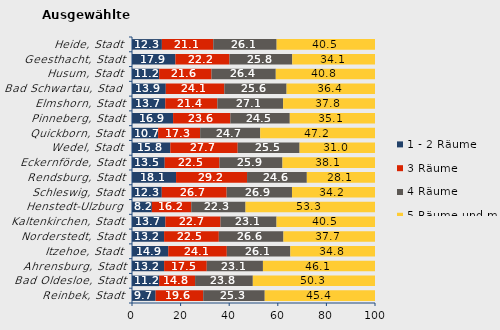
| Category | 1 - 2 Räume | 3 Räume | 4 Räume | 5 Räume und mehr |
|---|---|---|---|---|
| Reinbek, Stadt | 9.713 | 19.592 | 25.317 | 45.378 |
| Bad Oldesloe, Stadt | 11.156 | 14.805 | 23.761 | 50.279 |
| Ahrensburg, Stadt | 13.22 | 17.549 | 23.117 | 46.114 |
| Itzehoe, Stadt | 14.922 | 24.098 | 26.146 | 34.834 |
| Norderstedt, Stadt | 13.206 | 22.527 | 26.587 | 37.679 |
| Kaltenkirchen, Stadt | 13.749 | 22.67 | 23.06 | 40.521 |
| Henstedt-Ulzburg | 8.175 | 16.219 | 22.321 | 53.286 |
| Schleswig, Stadt | 12.256 | 26.692 | 26.889 | 34.163 |
| Rendsburg, Stadt | 18.13 | 29.217 | 24.602 | 28.051 |
| Eckernförde, Stadt | 13.463 | 22.53 | 25.924 | 38.083 |
| Wedel, Stadt | 15.779 | 27.725 | 25.463 | 31.033 |
| Quickborn, Stadt | 10.742 | 17.303 | 24.727 | 47.227 |
| Pinneberg, Stadt | 16.904 | 23.576 | 24.454 | 35.066 |
| Elmshorn, Stadt | 13.7 | 21.434 | 27.058 | 37.808 |
| Bad Schwartau, Stadt | 13.903 | 24.099 | 25.61 | 36.388 |
| Husum, Stadt | 11.162 | 21.558 | 26.449 | 40.831 |
| Geesthacht, Stadt | 17.867 | 22.242 | 25.838 | 34.053 |
| Heide, Stadt | 12.296 | 21.149 | 26.081 | 40.474 |